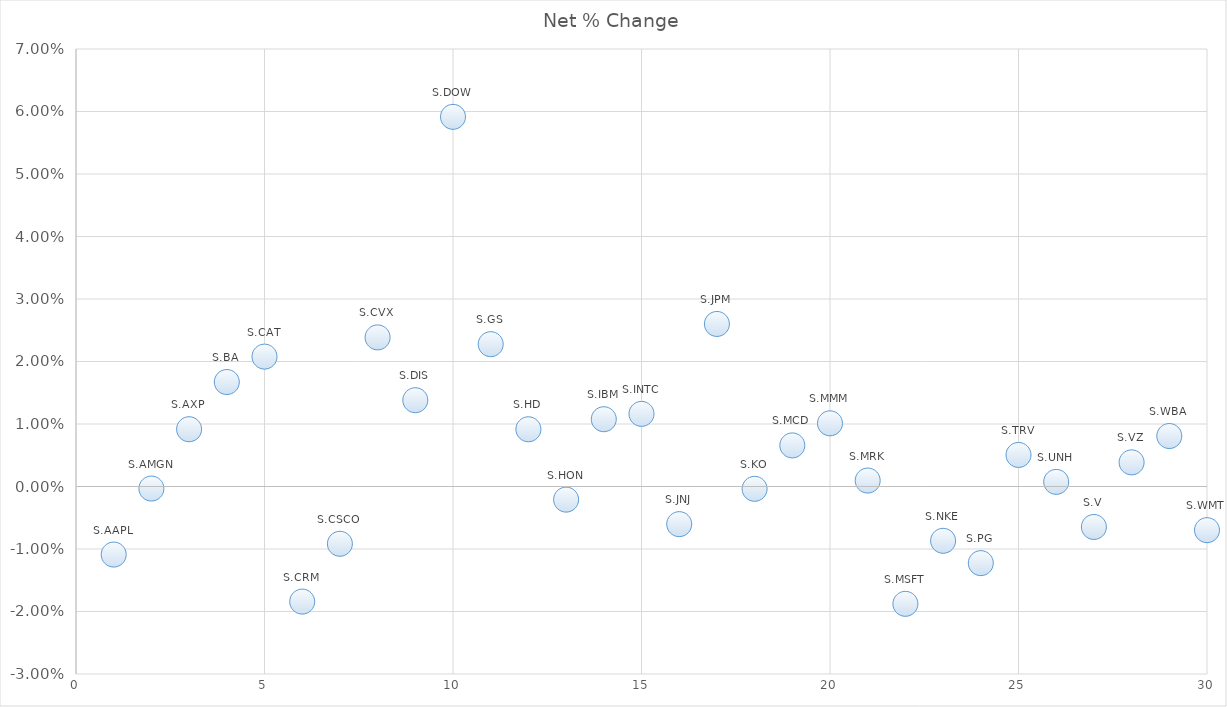
| Category | Series 0 |
|---|---|
| 0 | -0.011 |
| 1 | 0 |
| 2 | 0.009 |
| 3 | 0.017 |
| 4 | 0.021 |
| 5 | -0.018 |
| 6 | -0.009 |
| 7 | 0.024 |
| 8 | 0.014 |
| 9 | 0.059 |
| 10 | 0.023 |
| 11 | 0.009 |
| 12 | -0.002 |
| 13 | 0.011 |
| 14 | 0.012 |
| 15 | -0.006 |
| 16 | 0.026 |
| 17 | 0 |
| 18 | 0.007 |
| 19 | 0.01 |
| 20 | 0.001 |
| 21 | -0.019 |
| 22 | -0.009 |
| 23 | -0.012 |
| 24 | 0.005 |
| 25 | 0.001 |
| 26 | -0.006 |
| 27 | 0.004 |
| 28 | 0.008 |
| 29 | -0.007 |